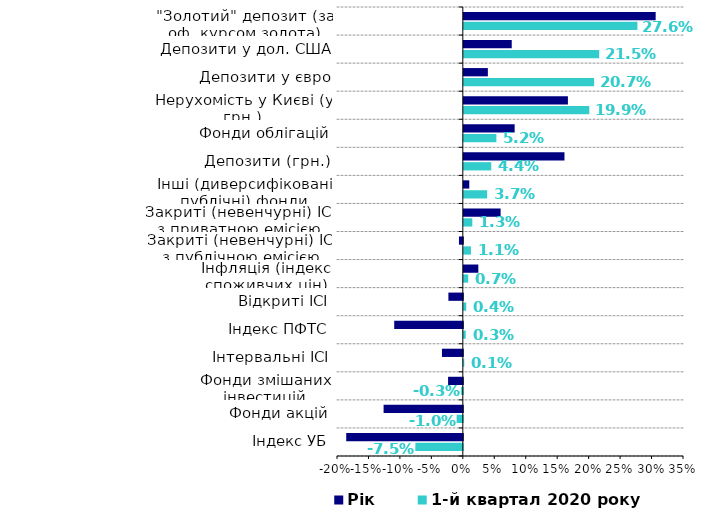
| Category | 1-й квартал 2020 року | Рік |
|---|---|---|
| Індекс УБ | -0.075 | -0.185 |
| Фонди акцій | -0.01 | -0.126 |
| Фонди змішаних інвестицій | -0.003 | -0.023 |
| Інтервальні ІСІ | 0.001 | -0.033 |
| Індекс ПФТС | 0.003 | -0.109 |
| Відкриті ІСІ | 0.004 | -0.023 |
| Інфляція (індекс споживчих цін) | 0.007 | 0.023 |
| Закриті (невенчурні) ІСІ з публічною емісією | 0.011 | -0.006 |
| Закриті (невенчурні) ІСІ з приватною емісією | 0.013 | 0.059 |
| Інші (диверсифіковані публічні) фонди | 0.037 | 0.009 |
| Депозити (грн.) | 0.044 | 0.16 |
| Фонди облігацій | 0.052 | 0.081 |
| Нерухомість у Києві (у грн.) | 0.199 | 0.165 |
| Депозити у євро | 0.207 | 0.038 |
| Депозити у дол. США | 0.215 | 0.076 |
| "Золотий" депозит (за оф. курсом золота) | 0.276 | 0.305 |